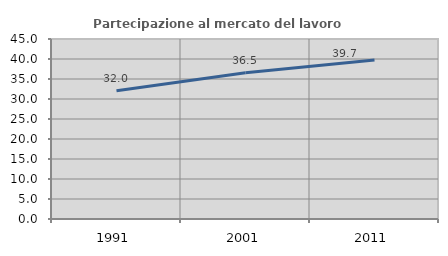
| Category | Partecipazione al mercato del lavoro  femminile |
|---|---|
| 1991.0 | 32.046 |
| 2001.0 | 36.546 |
| 2011.0 | 39.734 |